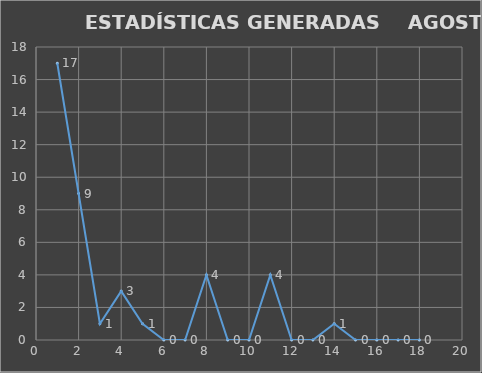
| Category |                   ESTADÍSTICAS GENERADAS  |
|---|---|
| 0 | 17 |
| 1 | 9 |
| 2 | 1 |
| 3 | 3 |
| 4 | 1 |
| 5 | 0 |
| 6 | 0 |
| 7 | 4 |
| 8 | 0 |
| 9 | 0 |
| 10 | 4 |
| 11 | 0 |
| 12 | 0 |
| 13 | 1 |
| 14 | 0 |
| 15 | 0 |
| 16 | 0 |
| 17 | 0 |